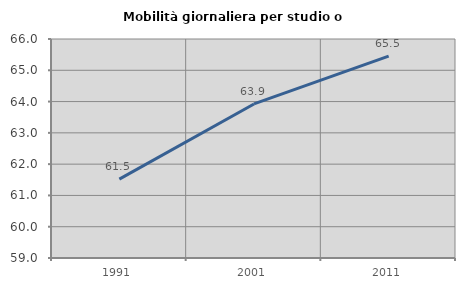
| Category | Mobilità giornaliera per studio o lavoro |
|---|---|
| 1991.0 | 61.52 |
| 2001.0 | 63.924 |
| 2011.0 | 65.452 |